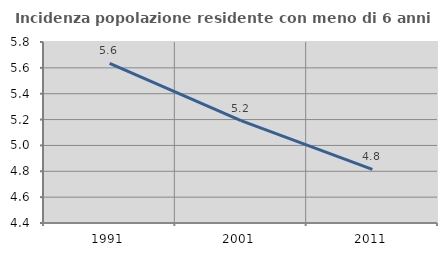
| Category | Incidenza popolazione residente con meno di 6 anni |
|---|---|
| 1991.0 | 5.635 |
| 2001.0 | 5.192 |
| 2011.0 | 4.815 |